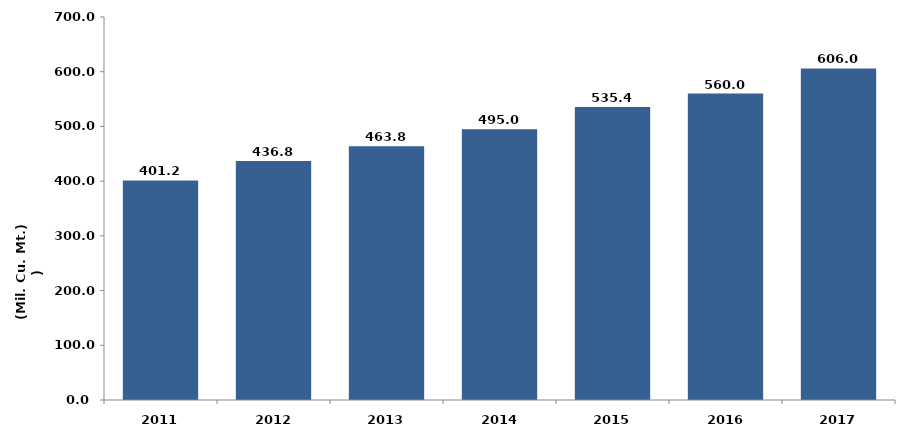
| Category |  انتاج المياه 
( مليون متر مكعب  ) Water Production
(Million Cubic Meters) |
|---|---|
| 2011 | 401.2 |
| 2012 | 436.8 |
| 2013 | 463.8 |
| 2014 | 494.961 |
| 2015 | 535.4 |
| 2016 | 560 |
| 2017 | 606 |